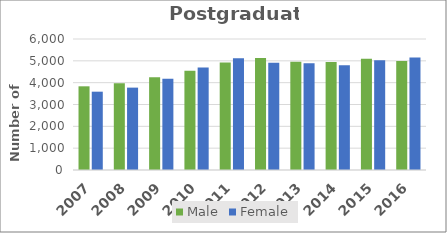
| Category | Male | Female |
|---|---|---|
| 2007 | 3833 | 3587 |
| 2008 | 3968 | 3773 |
| 2009 | 4245 | 4180 |
| 2010 | 4542 | 4691 |
| 2011 | 4919 | 5124 |
| 2012 | 5129 | 4914 |
| 2013 | 4963 | 4890 |
| 2014 | 4951 | 4802 |
| 2015 | 5095 | 5024 |
| 2016 | 4996 | 5158 |